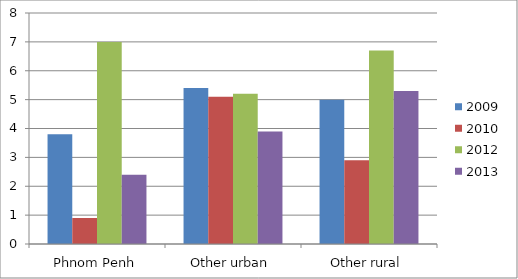
| Category | 2009 | 2010 | 2012 | 2013 |
|---|---|---|---|---|
| Phnom Penh | 3.8 | 0.9 | 7 | 2.4 |
| Other urban | 5.4 | 5.1 | 5.2 | 3.9 |
| Other rural | 5 | 2.9 | 6.7 | 5.3 |